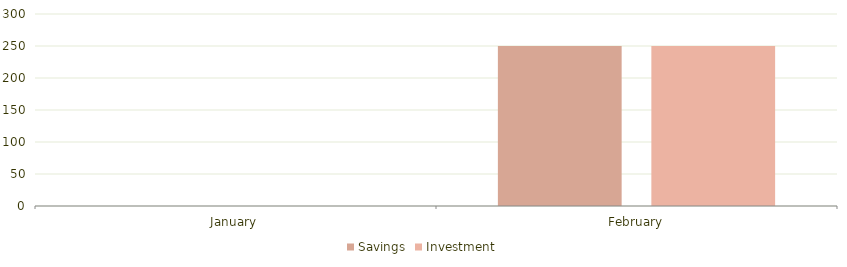
| Category | Savings | Investment |
|---|---|---|
| January | 0 | 0 |
| February | 250 | 250 |